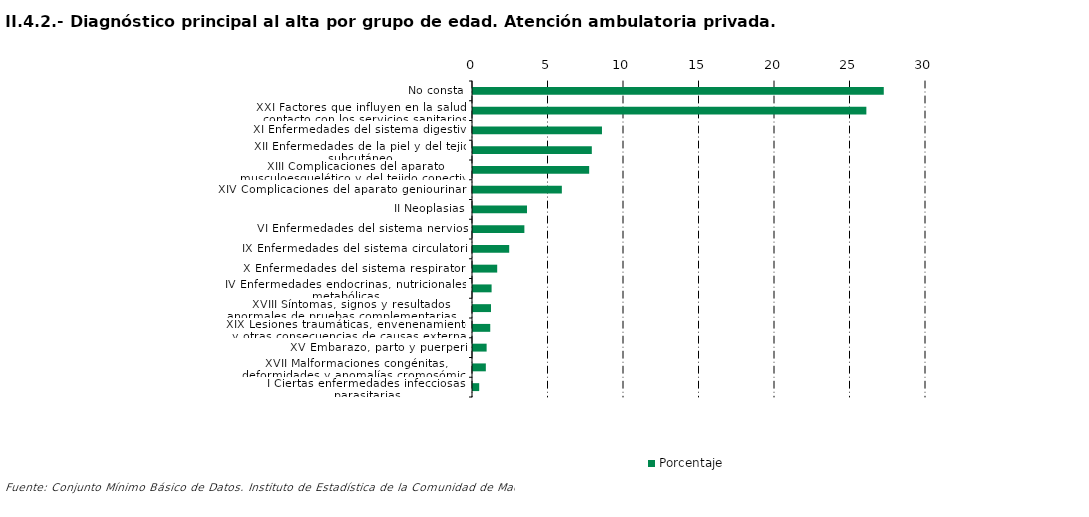
| Category | Porcentaje |
|---|---|
| No consta | 27.204 |
| XXI Factores que influyen en la salud y contacto con los servicios sanitarios | 26.051 |
| XI Enfermedades del sistema digestivo | 8.541 |
| XII Enfermedades de la piel y del tejido subcutáneo | 7.869 |
| XIII Complicaciones del aparato musculoesquelético y del tejido conectivo | 7.693 |
| XIV Complicaciones del aparato geniourinario | 5.884 |
| II Neoplasias | 3.576 |
| VI Enfermedades del sistema nervioso | 3.403 |
| IX Enfermedades del sistema circulatorio | 2.397 |
| X Enfermedades del sistema respiratorio | 1.602 |
| IV Enfermedades endocrinas, nutricionales y metabólicas | 1.232 |
| XVIII Síntomas, signos y resultados anormales de pruebas complementarias, no clasificados bajo otro concepto | 1.192 |
| XIX Lesiones traumáticas, envenenamientos y otras consecuencias de causas externas | 1.143 |
| XV Embarazo, parto y puerperio | 0.902 |
| XVII Malformaciones congénitas, deformidades y anomalías cromosómicas | 0.85 |
| I Ciertas enfermedades infecciosas y parasitarias | 0.41 |